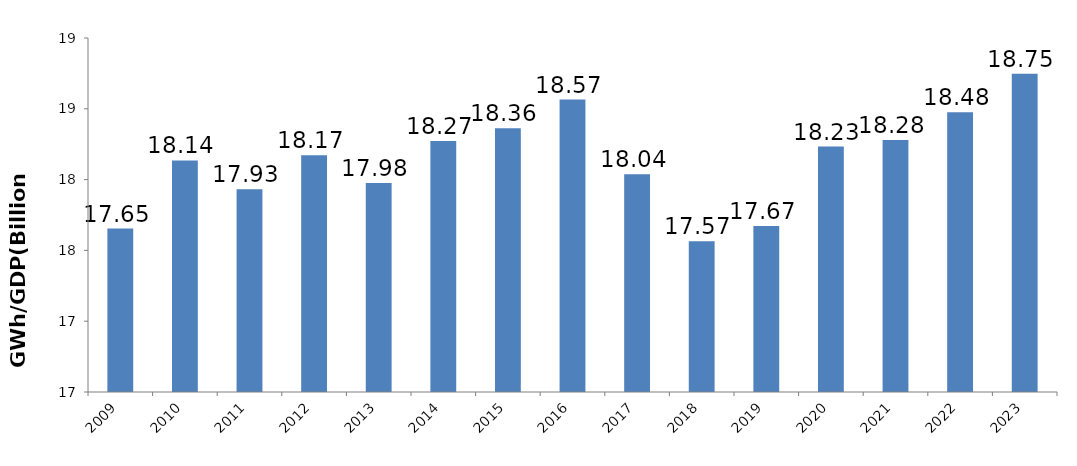
| Category | ELC Per GDP (GWh/Billion Bahts) |
|---|---|
| 2009 | 17.654 |
| 2010 | 18.136 |
| 2011 | 17.931 |
| 2012 | 18.172 |
| 2013 | 17.976 |
| 2014 | 18.273 |
| 2015 | 18.362 |
| 2016 | 18.565 |
| 2017 | 18.038 |
| 2018 | 17.565 |
| 2019 | 17.671 |
| 2020 | 18.233 |
| 2021 | 18.28 |
| 2022 | 18.476 |
| 2023 | 18.748 |